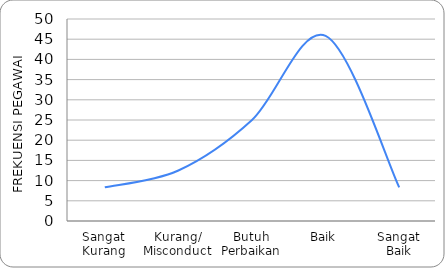
| Category | KURVA DISTRIBUSI
PREDIKAT KINERJA PEGAWAI DENGAN
CAPAIAN KINERJA ORGANISASI ISTIMEWA |
|---|---|
| Sangat
Kurang | 8.333 |
| Kurang/
Misconduct | 12.5 |
| Butuh
Perbaikan | 25 |
| Baik | 45.833 |
| Sangat
Baik | 8.333 |